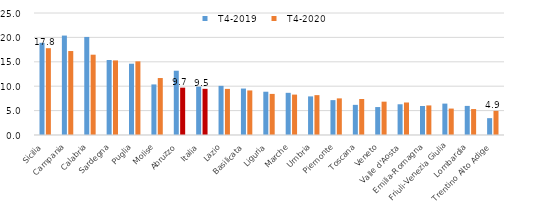
| Category |   T4-2019 |   T4-2020 |
|---|---|---|
|   Sicilia | 18.889 | 17.786 |
|   Campania | 20.374 | 17.205 |
|   Calabria | 20.094 | 16.457 |
|   Sardegna | 15.364 | 15.284 |
|   Puglia | 14.61 | 15.092 |
|   Molise | 10.364 | 11.673 |
|   Abruzzo | 13.172 | 9.7 |
| Italia | 9.911 | 9.461 |
|   Lazio | 10.073 | 9.451 |
|   Basilicata | 9.52 | 9.131 |
|   Liguria | 8.867 | 8.422 |
|   Marche | 8.642 | 8.279 |
|   Umbria | 7.911 | 8.17 |
|   Piemonte | 7.146 | 7.505 |
|   Toscana | 6.179 | 7.372 |
|   Veneto | 5.725 | 6.831 |
|   Valle d'Aosta | 6.299 | 6.661 |
|   Emilia-Romagna | 5.944 | 6.061 |
|   Friuli-Venezia Giulia | 6.433 | 5.415 |
|   Lombardia | 5.963 | 5.316 |
|   Trentino Alto Adige | 3.451 | 4.948 |